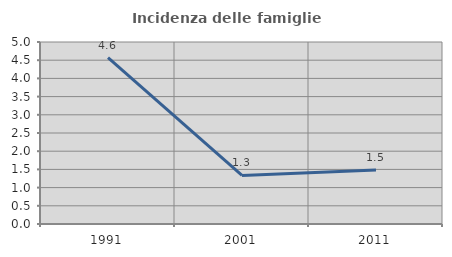
| Category | Incidenza delle famiglie numerose |
|---|---|
| 1991.0 | 4.568 |
| 2001.0 | 1.333 |
| 2011.0 | 1.48 |